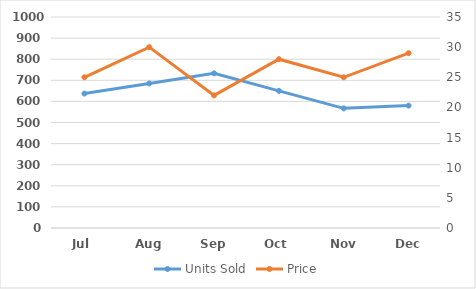
| Category | Units Sold |
|---|---|
| Jul | 637 |
| Aug | 685 |
| Sep | 733 |
| Oct | 650 |
| Nov | 567 |
| Dec | 580 |